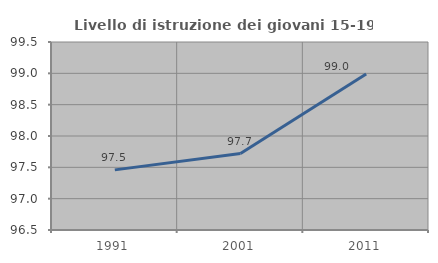
| Category | Livello di istruzione dei giovani 15-19 anni |
|---|---|
| 1991.0 | 97.459 |
| 2001.0 | 97.719 |
| 2011.0 | 98.99 |